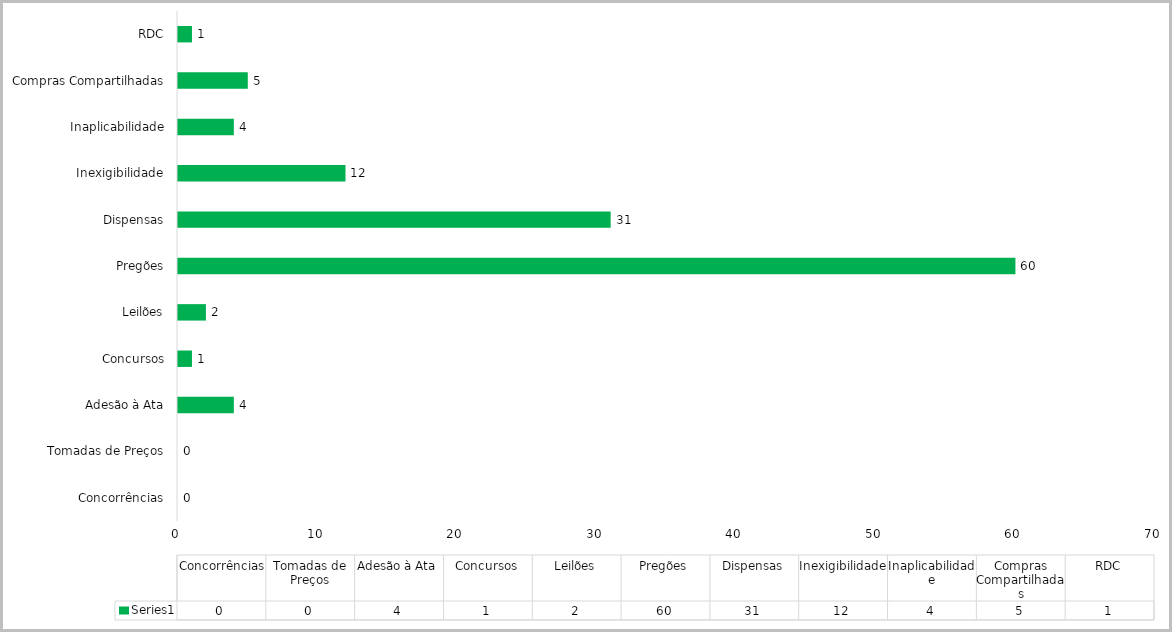
| Category | Series 0 |
|---|---|
| Concorrências | 0 |
| Tomadas de Preços | 0 |
| Adesão à Ata | 4 |
| Concursos | 1 |
| Leilões | 2 |
| Pregões | 60 |
| Dispensas | 31 |
| Inexigibilidade | 12 |
| Inaplicabilidade | 4 |
| Compras Compartilhadas | 5 |
| RDC | 1 |